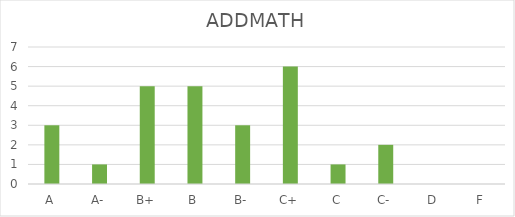
| Category | ADDMATH |
|---|---|
| A | 3 |
| A- | 1 |
| B+ | 5 |
| B | 5 |
| B- | 3 |
| C+ | 6 |
| C | 1 |
| C- | 2 |
| D | 0 |
| F | 0 |